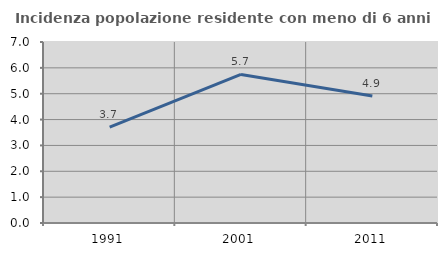
| Category | Incidenza popolazione residente con meno di 6 anni |
|---|---|
| 1991.0 | 3.707 |
| 2001.0 | 5.746 |
| 2011.0 | 4.908 |